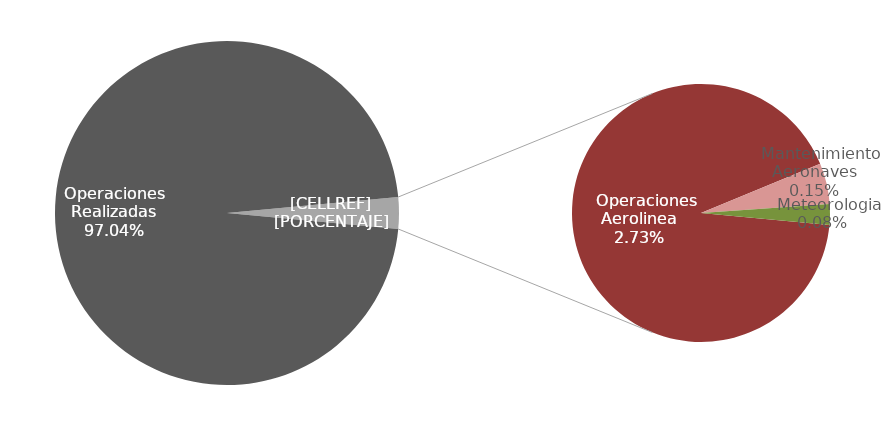
| Category | Series 0 |
|---|---|
| Operaciones Realizadas | 6354 |
|    Operaciones Aerolinea | 179 |
|    Mantenimiento Aeronaves | 10 |
|    Otras Imputables | 0 |
|    Meteorologia | 5 |
|    Otras No Imputables | 0 |